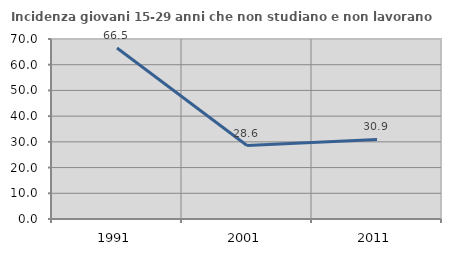
| Category | Incidenza giovani 15-29 anni che non studiano e non lavorano  |
|---|---|
| 1991.0 | 66.515 |
| 2001.0 | 28.571 |
| 2011.0 | 30.921 |